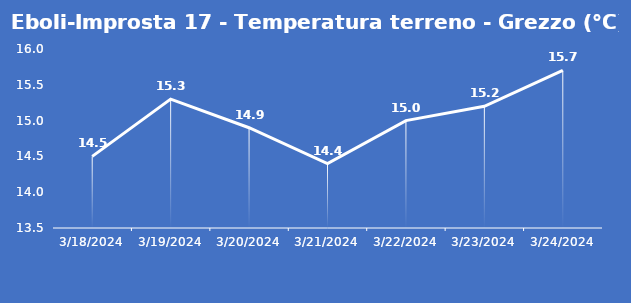
| Category | Eboli-Improsta 17 - Temperatura terreno - Grezzo (°C) |
|---|---|
| 3/18/24 | 14.5 |
| 3/19/24 | 15.3 |
| 3/20/24 | 14.9 |
| 3/21/24 | 14.4 |
| 3/22/24 | 15 |
| 3/23/24 | 15.2 |
| 3/24/24 | 15.7 |